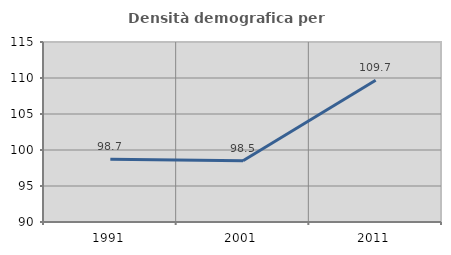
| Category | Densità demografica |
|---|---|
| 1991.0 | 98.727 |
| 2001.0 | 98.5 |
| 2011.0 | 109.697 |